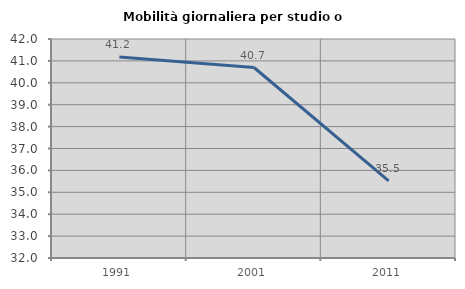
| Category | Mobilità giornaliera per studio o lavoro |
|---|---|
| 1991.0 | 41.176 |
| 2001.0 | 40.698 |
| 2011.0 | 35.517 |